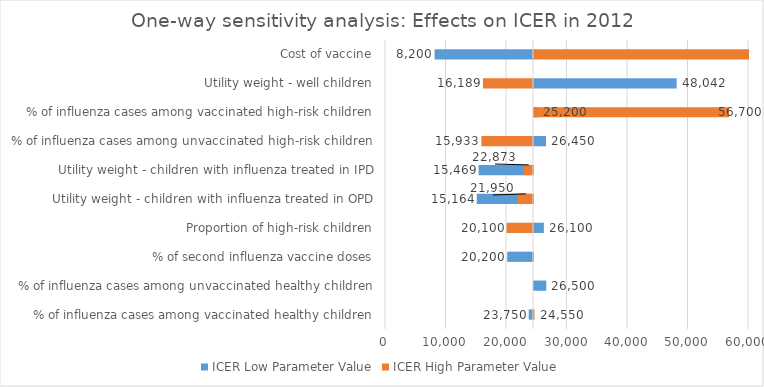
| Category | ICER Low Parameter Value | ICER High Parameter Value |
|---|---|---|
| % of influenza cases among vaccinated healthy children | 23750 | 24550 |
| % of influenza cases among unvaccinated healthy children | 26500 | 24450 |
| % of second influenza vaccine doses | 20200 | 24450 |
| Proportion of high-risk children | 26100 | 20100 |
| Utility weight - children with influenza treated in OPD | 15164 | 21950 |
| Utility weight - children with influenza treated in IPD | 15469 | 22873 |
| % of influenza cases among unvaccinated high-risk children | 26450 | 15933 |
| % of influenza cases among vaccinated high-risk children | 25200 | 56700 |
| Utility weight - well children | 48042 | 16189 |
| Cost of vaccine | 8200 | 60000 |